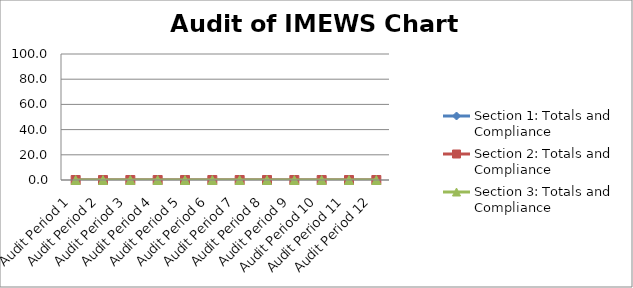
| Category | Section 1: Totals and Compliance | Section 2: Totals and Compliance | Section 3: Totals and Compliance |
|---|---|---|---|
| Audit Period 1 | 0 | 0 | 0 |
| Audit Period 2 | 0 | 0 | 0 |
| Audit Period 3 | 0 | 0 | 0 |
| Audit Period 4 | 0 | 0 | 0 |
| Audit Period 5 | 0 | 0 | 0 |
| Audit Period 6 | 0 | 0 | 0 |
| Audit Period 7 | 0 | 0 | 0 |
| Audit Period 8 | 0 | 0 | 0 |
| Audit Period 9 | 0 | 0 | 0 |
| Audit Period 10 | 0 | 0 | 0 |
| Audit Period 11 | 0 | 0 | 0 |
| Audit Period 12 | 0 | 0 | 0 |